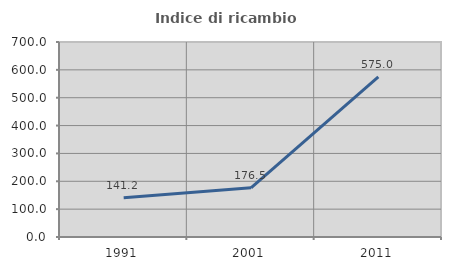
| Category | Indice di ricambio occupazionale  |
|---|---|
| 1991.0 | 141.176 |
| 2001.0 | 176.471 |
| 2011.0 | 575 |